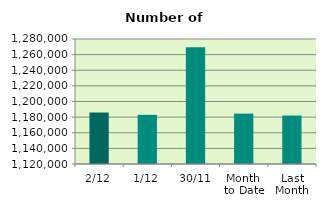
| Category | Series 0 |
|---|---|
| 2/12 | 1186002 |
| 1/12 | 1182962 |
| 30/11 | 1269494 |
| Month 
to Date | 1184482 |
| Last
Month | 1182027.273 |